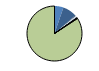
| Category | Series 0 |
|---|---|
| ARRASTRE | 12 |
| CERCO | 19 |
| ATUNEROS CAÑEROS | 1 |
| PALANGRE DE FONDO | 1 |
| PALANGRE DE SUPERFICIE | 2 |
| RASCO | 0 |
| VOLANTA | 0 |
| ARTES FIJAS | 1 |
| ARTES MENORES | 192 |